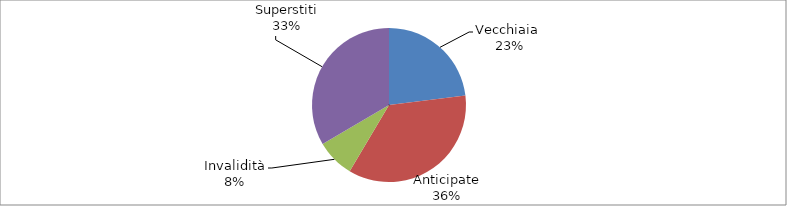
| Category | Series 0 |
|---|---|
| Vecchiaia  | 81787 |
| Anticipate | 125888 |
| Invalidità | 28444 |
| Superstiti | 118697 |